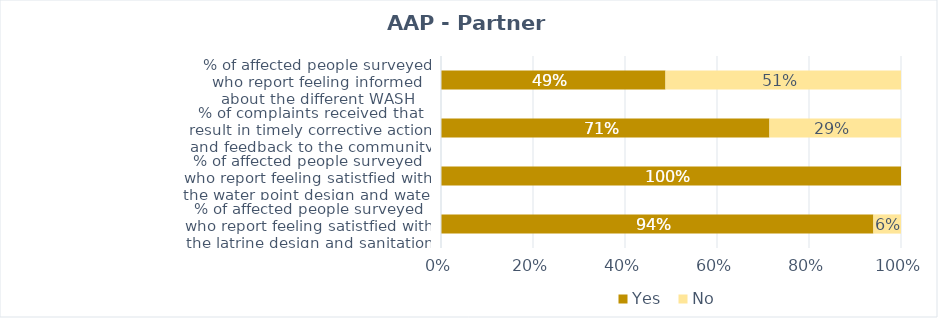
| Category | Yes | No |
|---|---|---|
| % of affected people surveyed who report feeling satistfied with the latrine design and sanitation service | 0.94 | 0.06 |
| % of affected people surveyed who report feeling satistfied with the water point design and water service | 1 | 0 |
| % of complaints received that result in timely corrective action and feedback to the community | 0.714 | 0.286 |
| % of affected people surveyed who report feeling informed about the different WASH services available to them | 0.488 | 0.512 |